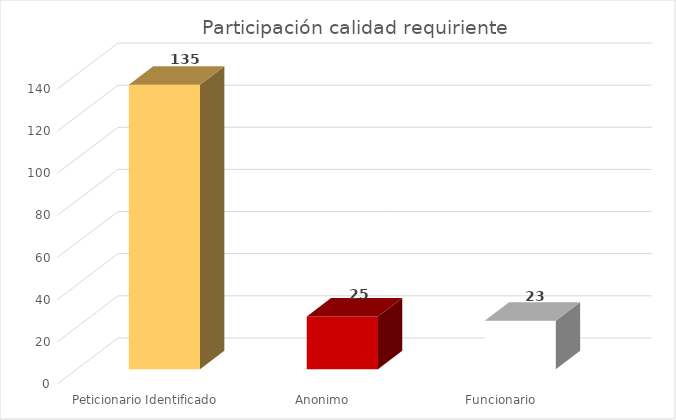
| Category | Total |
|---|---|
| Peticionario Identificado | 135 |
| Anonimo | 25 |
| Funcionario | 23 |